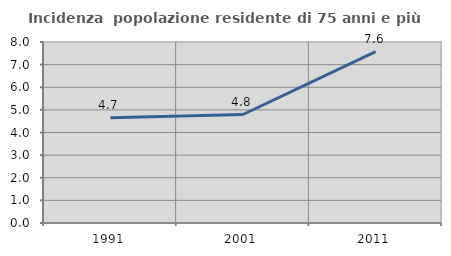
| Category | Incidenza  popolazione residente di 75 anni e più |
|---|---|
| 1991.0 | 4.655 |
| 2001.0 | 4.795 |
| 2011.0 | 7.578 |